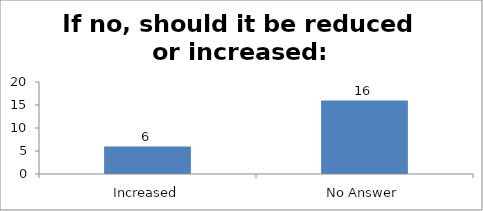
| Category | If no, should it be reduced or increased: |
|---|---|
| Increased | 6 |
| No Answer | 16 |